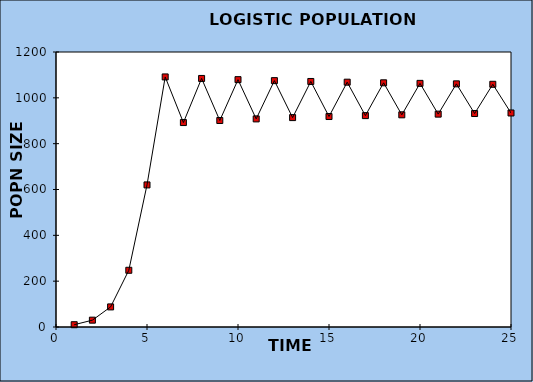
| Category | Series 0 |
|---|---|
| 1.0 | 10 |
| 2.0 | 29.8 |
| 3.0 | 87.624 |
| 4.0 | 247.516 |
| 5.0 | 620.019 |
| 6.0 | 1091.21 |
| 7.0 | 892.151 |
| 8.0 | 1084.586 |
| 9.0 | 901.104 |
| 10.0 | 1079.335 |
| 11.0 | 908.077 |
| 12.0 | 1075.023 |
| 13.0 | 913.72 |
| 14.0 | 1071.392 |
| 15.0 | 918.415 |
| 16.0 | 1068.273 |
| 17.0 | 922.405 |
| 18.0 | 1065.553 |
| 19.0 | 925.852 |
| 20.0 | 1063.152 |
| 21.0 | 928.872 |
| 22.0 | 1061.01 |
| 23.0 | 931.546 |
| 24.0 | 1059.082 |
| 25.0 | 933.936 |